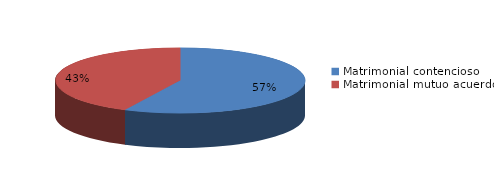
| Category | Series 0 |
|---|---|
| 0 | 740 |
| 1 | 553 |